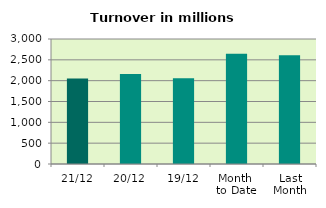
| Category | Series 0 |
|---|---|
| 21/12 | 2050.985 |
| 20/12 | 2158.596 |
| 19/12 | 2057.242 |
| Month 
to Date | 2644.012 |
| Last
Month | 2611.78 |